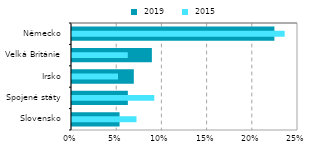
| Category |  2019 |
|---|---|
| Slovensko | 0.053 |
| Spojené státy | 0.062 |
| Irsko | 0.068 |
| Velká Británie | 0.088 |
| Německo | 0.224 |